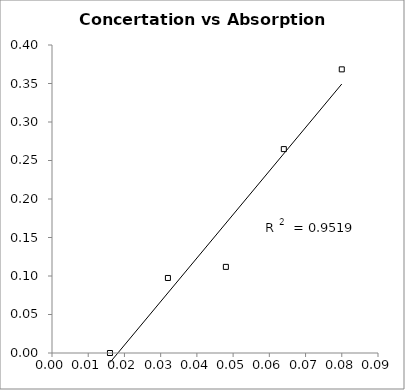
| Category | Green |
|---|---|
| 0.016 | 0 |
| 0.032 | 0.097 |
| 0.048 | 0.112 |
| 0.064 | 0.265 |
| 0.08 | 0.368 |